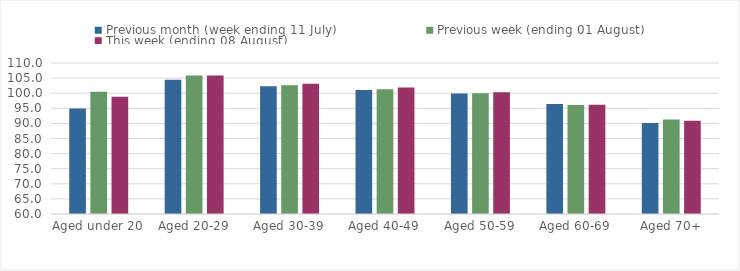
| Category | Previous month (week ending 11 July) | Previous week (ending 01 August) | This week (ending 08 August) |
|---|---|---|---|
| Aged under 20 | 94.897 | 100.482 | 98.832 |
| Aged 20-29 | 104.464 | 105.873 | 105.846 |
| Aged 30-39 | 102.278 | 102.656 | 103.115 |
| Aged 40-49 | 101.027 | 101.323 | 101.912 |
| Aged 50-59 | 99.874 | 99.973 | 100.35 |
| Aged 60-69 | 96.452 | 96.061 | 96.211 |
| Aged 70+ | 90.139 | 91.273 | 90.87 |